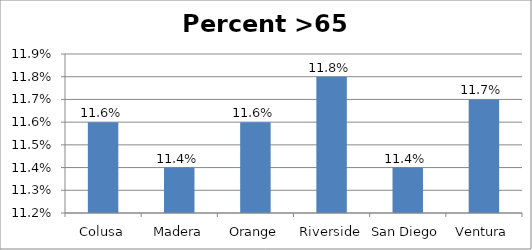
| Category | Series 0 |
|---|---|
| Colusa | 0.116 |
| Madera | 0.114 |
| Orange | 0.116 |
| Riverside | 0.118 |
| San Diego | 0.114 |
| Ventura | 0.117 |